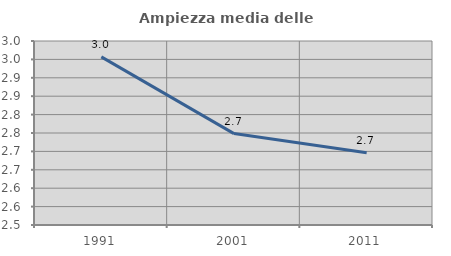
| Category | Ampiezza media delle famiglie |
|---|---|
| 1991.0 | 2.957 |
| 2001.0 | 2.748 |
| 2011.0 | 2.697 |